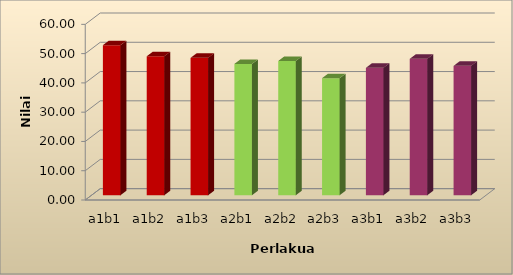
| Category | Rata-rata |
|---|---|
| a1b1 | 51.267 |
| a1b2 | 47.467 |
| a1b3 | 46.933 |
| a2b1 | 44.867 |
| a2b2 | 45.867 |
| a2b3 | 40 |
| a3b1 | 43.533 |
| a3b2 | 46.6 |
| a3b3 | 44.2 |